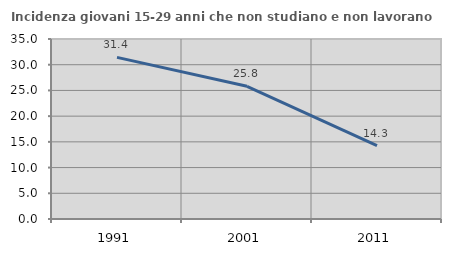
| Category | Incidenza giovani 15-29 anni che non studiano e non lavorano  |
|---|---|
| 1991.0 | 31.429 |
| 2001.0 | 25.806 |
| 2011.0 | 14.286 |